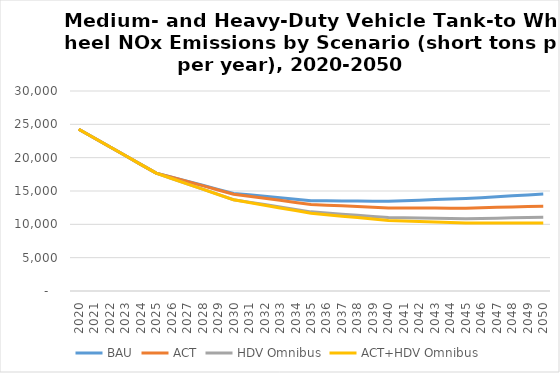
| Category | BAU | ACT | HDV Omnibus | ACT+HDV Omnibus |
|---|---|---|---|---|
| 2020.0 | 24270 | 24270 | 24270 | 24270 |
| 2021.0 | 22950 | 22950 | 22950 | 22950 |
| 2022.0 | 21630 | 21630 | 21630 | 21630 |
| 2023.0 | 20320 | 20320 | 20320 | 20320 |
| 2024.0 | 19000 | 19000 | 19000 | 19000 |
| 2025.0 | 17680 | 17680 | 17680 | 17680 |
| 2026.0 | 17070 | 17070 | 16880 | 16880 |
| 2027.0 | 16460 | 16430 | 16080 | 16080 |
| 2028.0 | 15860 | 15800 | 15290 | 15280 |
| 2029.0 | 15250 | 15160 | 14490 | 14480 |
| 2030.0 | 14640 | 14520 | 13690 | 13680 |
| 2031.0 | 14420 | 14210 | 13330 | 13270 |
| 2032.0 | 14200 | 13900 | 12960 | 12870 |
| 2033.0 | 13970 | 13600 | 12600 | 12460 |
| 2034.0 | 13750 | 13290 | 12230 | 12060 |
| 2035.0 | 13530 | 12980 | 11870 | 11650 |
| 2036.0 | 13520 | 12870 | 11700 | 11440 |
| 2037.0 | 13500 | 12770 | 11530 | 11220 |
| 2038.0 | 13490 | 12660 | 11360 | 11010 |
| 2039.0 | 13470 | 12560 | 11190 | 10790 |
| 2040.0 | 13460 | 12450 | 11020 | 10580 |
| 2041.0 | 13540 | 12450 | 10990 | 10500 |
| 2042.0 | 13620 | 12440 | 10950 | 10420 |
| 2043.0 | 13710 | 12440 | 10920 | 10350 |
| 2044.0 | 13790 | 12430 | 10880 | 10270 |
| 2045.0 | 13870 | 12430 | 10850 | 10190 |
| 2046.0 | 14000 | 12490 | 10890 | 10190 |
| 2047.0 | 14140 | 12550 | 10930 | 10190 |
| 2048.0 | 14270 | 12610 | 10970 | 10200 |
| 2049.0 | 14410 | 12670 | 11010 | 10200 |
| 2050.0 | 14540 | 12730 | 11050 | 10200 |